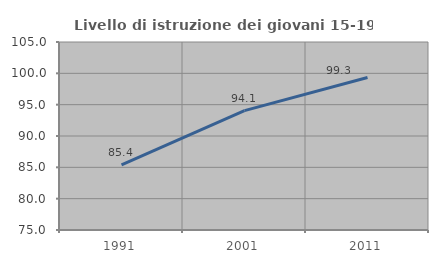
| Category | Livello di istruzione dei giovani 15-19 anni |
|---|---|
| 1991.0 | 85.385 |
| 2001.0 | 94.052 |
| 2011.0 | 99.344 |